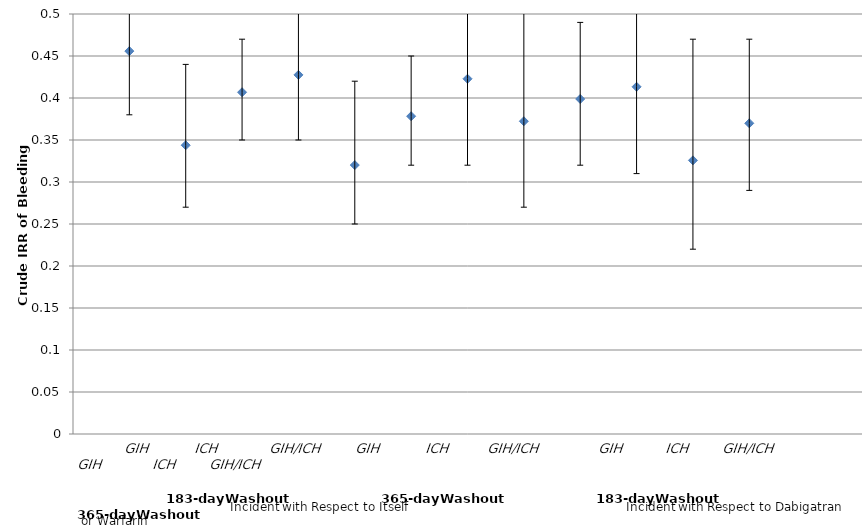
| Category | Series 0 |
|---|---|
| 0 | 0.456 |
| 1 | 0.344 |
| 2 | 0.407 |
| 3 | 0.428 |
| 4 | 0.32 |
| 5 | 0.378 |
| 6 | 0.423 |
| 7 | 0.372 |
| 8 | 0.399 |
| 9 | 0.413 |
| 10 | 0.326 |
| 11 | 0.37 |